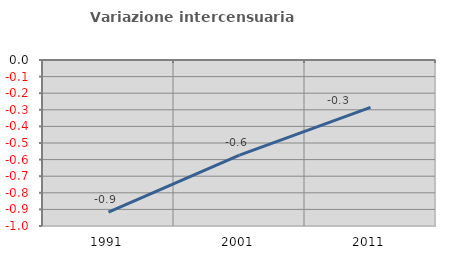
| Category | Variazione intercensuaria annua |
|---|---|
| 1991.0 | -0.917 |
| 2001.0 | -0.573 |
| 2011.0 | -0.286 |